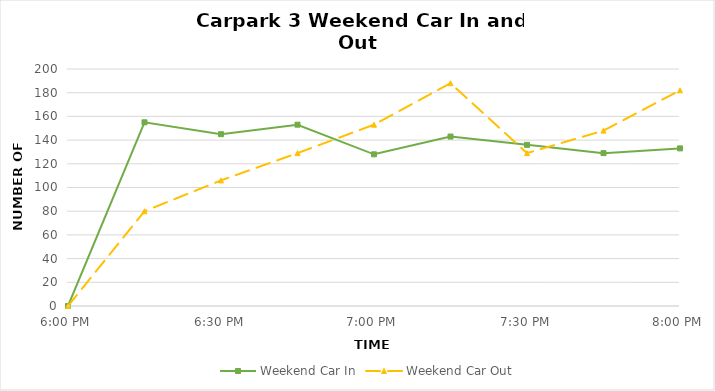
| Category | Weekend Car In | Weekend Car Out |
|---|---|---|
| 0.75 | 0 | 0 |
| 0.760416666666667 | 155 | 80 |
| 0.770833333333333 | 145 | 106 |
| 0.78125 | 153 | 129 |
| 0.791666666666667 | 128 | 153 |
| 0.802083333333333 | 143 | 188 |
| 0.8125 | 136 | 129 |
| 0.822916666666667 | 129 | 148 |
| 0.833333333333333 | 133 | 182 |